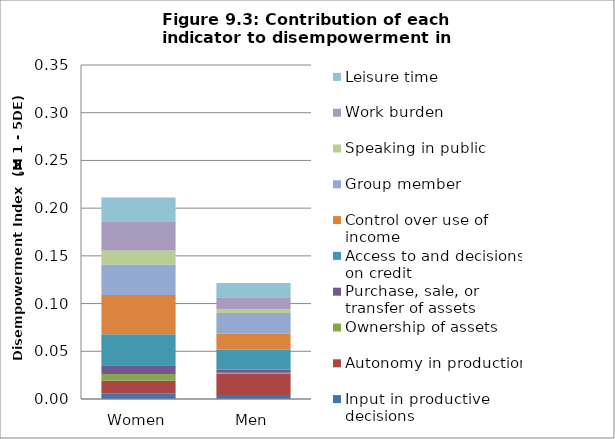
| Category | Input in productive decisions | Autonomy in production | Ownership of assets | Purchase, sale, or transfer of assets | Access to and decisions on credit | Control over use of income | Group member | Speaking in public | Work burden | Leisure time |
|---|---|---|---|---|---|---|---|---|---|---|
| Women | 0.006 | 0.013 | 0.007 | 0.009 | 0.032 | 0.041 | 0.032 | 0.015 | 0.031 | 0.025 |
| Men | 0.004 | 0.023 | 0.001 | 0.004 | 0.021 | 0.017 | 0.022 | 0.004 | 0.013 | 0.015 |